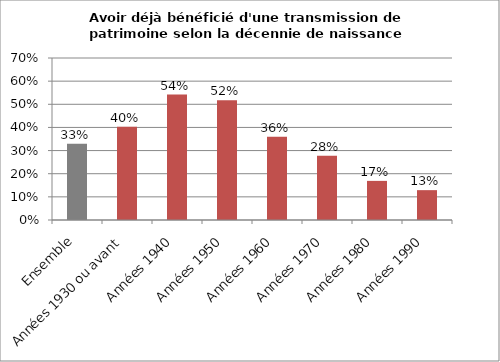
| Category | Avoir déjà bénéficié d'une transmission selon la décennie de naissance |
|---|---|
| Ensemble | 0.33 |
| Années 1930 ou avant | 0.403 |
| Années 1940 | 0.542 |
| Années 1950 | 0.517 |
| Années 1960 | 0.36 |
| Années 1970 | 0.278 |
| Années 1980 | 0.169 |
| Années 1990 | 0.129 |